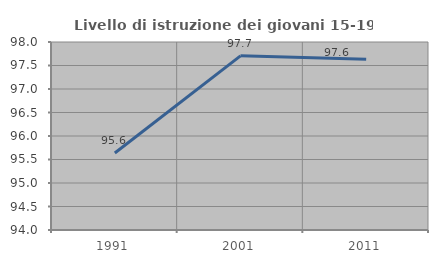
| Category | Livello di istruzione dei giovani 15-19 anni |
|---|---|
| 1991.0 | 95.64 |
| 2001.0 | 97.705 |
| 2011.0 | 97.633 |